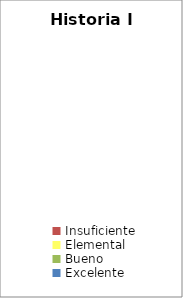
| Category | Historia I |
|---|---|
| Insuficiente | 0 |
| Elemental | 0 |
| Bueno | 0 |
| Excelente | 0 |